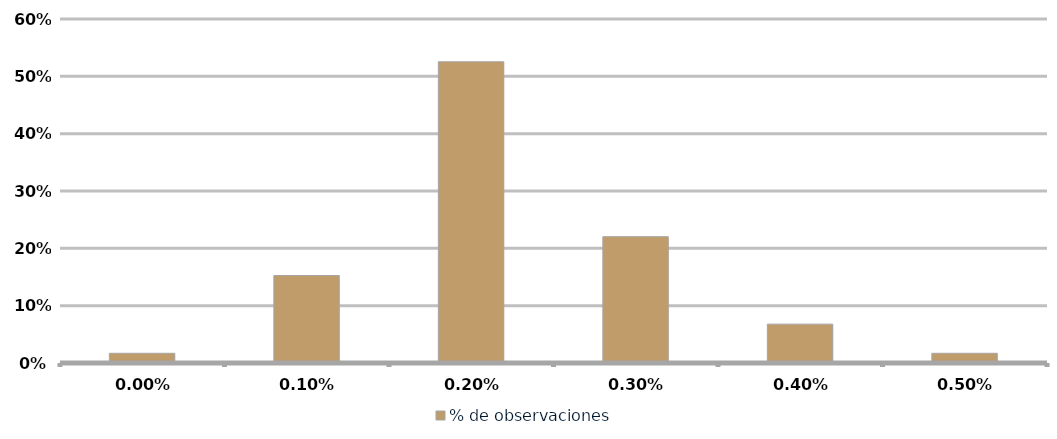
| Category | % de observaciones  |
|---|---|
| 0.0 | 0.017 |
| 0.001 | 0.153 |
| 0.002 | 0.525 |
| 0.003 | 0.22 |
| 0.004 | 0.068 |
| 0.005 | 0.017 |